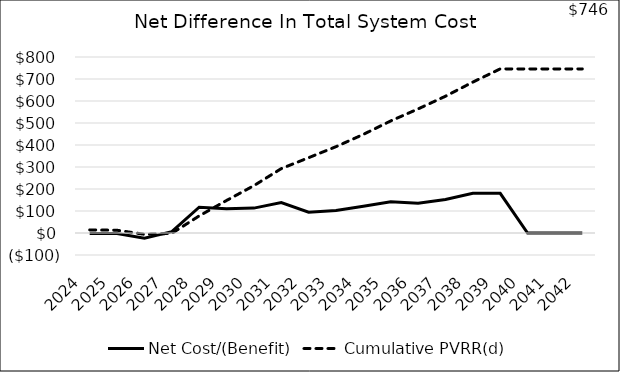
| Category | Net Cost/(Benefit) | Cumulative PVRR(d) |
|---|---|---|
| 2024.0 | -2.197 | 14.127 |
| 2025.0 | -1.938 | 12.531 |
| 2026.0 | -24.064 | -6.041 |
| 2027.0 | 5.893 | -1.778 |
| 2028.0 | 117.155 | 77.658 |
| 2029.0 | 110.307 | 147.761 |
| 2030.0 | 113.204 | 215.194 |
| 2031.0 | 138.734 | 292.652 |
| 2032.0 | 94.746 | 342.234 |
| 2033.0 | 102.381 | 392.452 |
| 2034.0 | 121.263 | 448.202 |
| 2035.0 | 142.219 | 509.486 |
| 2036.0 | 134.968 | 563.999 |
| 2037.0 | 152.496 | 621.729 |
| 2038.0 | 180.865 | 685.906 |
| 2039.0 | 180.356 | 745.888 |
| 2040.0 | -0.28 | 745.801 |
| 2041.0 | -0.115 | 745.767 |
| 2042.0 | 0.174 | 745.815 |